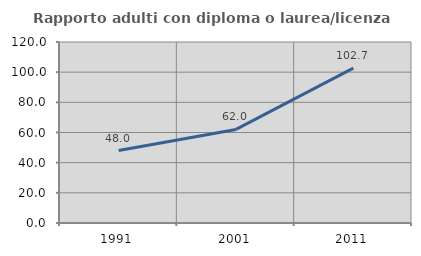
| Category | Rapporto adulti con diploma o laurea/licenza media  |
|---|---|
| 1991.0 | 48 |
| 2001.0 | 62.032 |
| 2011.0 | 102.715 |